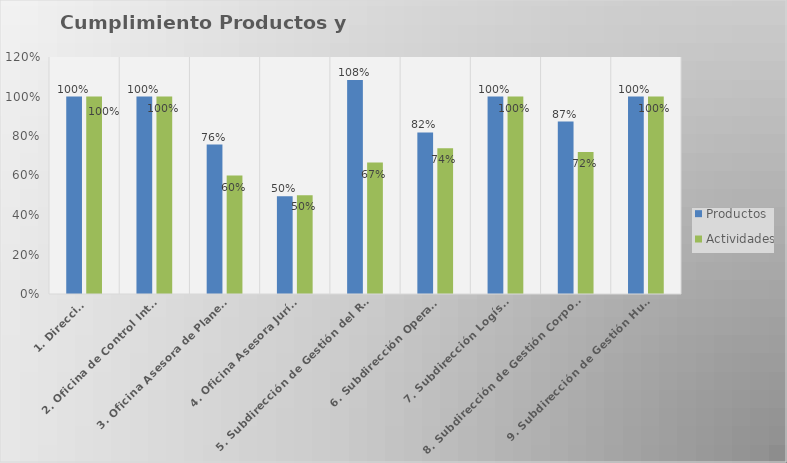
| Category | Productos | Actividades |
|---|---|---|
| 1. Dirección | 1 | 1 |
| 2. Oficina de Control Interno | 1 | 1 |
| 3. Oficina Asesora de Planeación | 0.757 | 0.6 |
| 4. Oficina Asesora Jurídica | 0.495 | 0.5 |
| 5. Subdirección de Gestión del Riesgo | 1.083 | 0.665 |
| 6. Subdirección Operativa | 0.818 | 0.738 |
| 7. Subdirección Logística | 1 | 1 |
| 8. Subdirección de Gestión Corporativa | 0.873 | 0.719 |
| 9. Subdirección de Gestión Humana | 1 | 1 |